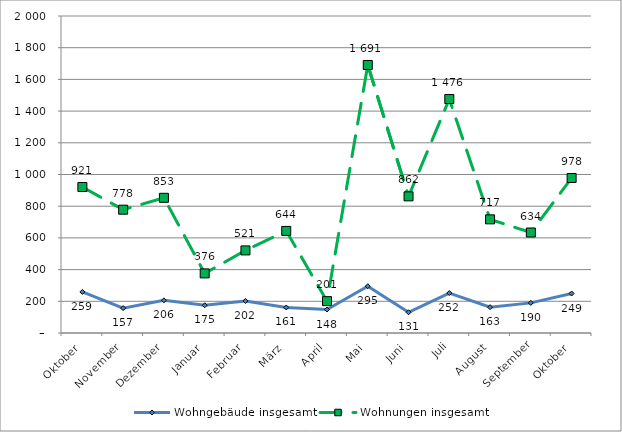
| Category | Wohngebäude insgesamt | Wohnungen insgesamt |
|---|---|---|
| Oktober | 259 | 921 |
| November | 157 | 778 |
| Dezember | 206 | 853 |
| Januar | 175 | 376 |
| Februar | 202 | 521 |
| März | 161 | 644 |
| April | 148 | 201 |
| Mai | 295 | 1691 |
| Juni | 131 | 862 |
| Juli | 252 | 1476 |
| August | 163 | 717 |
| September | 190 | 634 |
| Oktober | 249 | 978 |